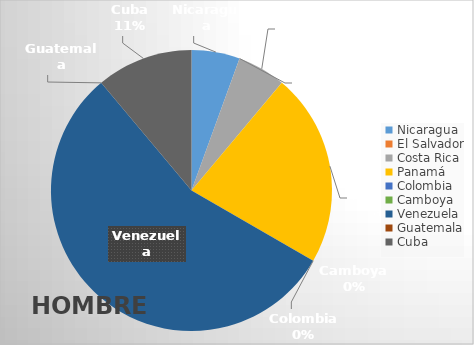
| Category | Series 0 |
|---|---|
| Nicaragua | 1 |
| El Salvador | 0 |
| Costa Rica | 1 |
| Panamá | 4 |
| Colombia  | 0 |
| Camboya | 0 |
| Venezuela | 10 |
| Guatemala | 0 |
| Cuba | 2 |